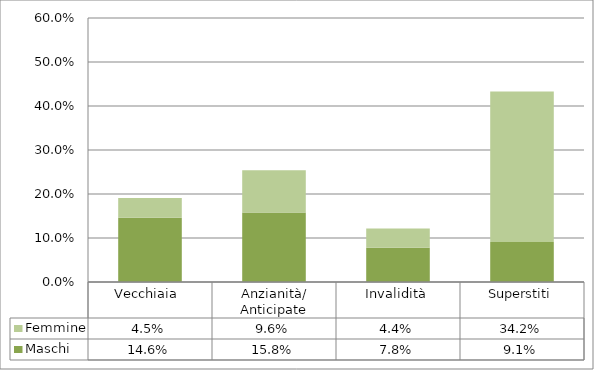
| Category | Maschi | Femmine |
|---|---|---|
| Vecchiaia  | 0.146 | 0.045 |
| Anzianità/ Anticipate | 0.158 | 0.096 |
| Invalidità | 0.078 | 0.044 |
| Superstiti | 0.091 | 0.342 |